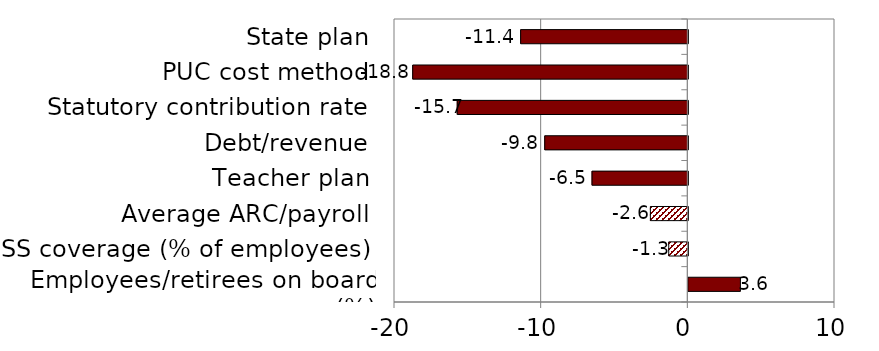
| Category | Series 0 |
|---|---|
| Employees/retirees on board (%) | 3.551 |
| SS coverage (% of employees) | -1.301 |
| Average ARC/payroll | -2.553 |
| Teacher plan | -6.532 |
| Debt/revenue | -9.756 |
| Statutory contribution rate | -15.722 |
| PUC cost method | -18.759 |
| State plan | -11.399 |